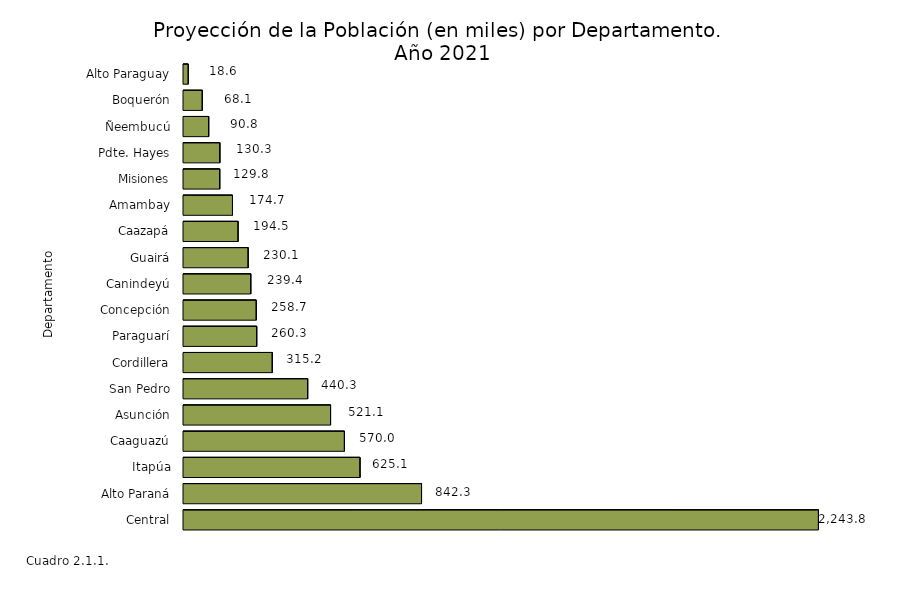
| Category | Series 0 |
|---|---|
| Central | 2243.792 |
| Alto Paraná | 842.307 |
| Itapúa | 625.096 |
| Caaguazú | 569.967 |
| Asunción | 521.101 |
| San Pedro | 440.335 |
| Cordillera | 315.245 |
| Paraguarí | 260.331 |
| Concepción | 258.653 |
| Canindeyú | 239.386 |
| Guairá | 230.112 |
| Caazapá | 194.512 |
| Amambay | 174.721 |
| Misiones | 129.787 |
| Pdte. Hayes | 130.258 |
| Ñeembucú | 90.774 |
| Boquerón | 68.08 |
| Alto Paraguay | 18.581 |